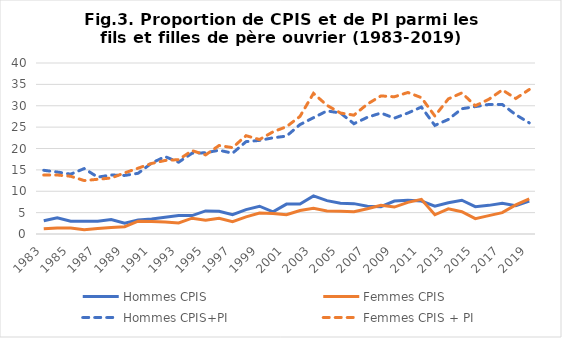
| Category | Hommes CPIS | Femmes CPIS | Hommes CPIS+PI | Femmes CPIS + PI |
|---|---|---|---|---|
| 1983.0 | 3.1 | 1.2 | 14.9 | 13.8 |
| 1984.0 | 3.8 | 1.4 | 14.5 | 13.8 |
| 1985.0 | 3 | 1.4 | 14 | 13.5 |
| 1986.0 | 3 | 1 | 15.3 | 12.5 |
| 1987.0 | 3 | 1.3 | 13.3 | 12.8 |
| 1988.0 | 3.4 | 1.5 | 13.8 | 13.1 |
| 1989.0 | 2.5 | 1.7 | 13.7 | 14.3 |
| 1990.0 | 3.3 | 3 | 14.2 | 15.4 |
| 1991.0 | 3.5 | 2.9 | 16.6 | 16.5 |
| 1992.0 | 3.9 | 2.8 | 18.1 | 17.2 |
| 1993.0 | 4.3 | 2.6 | 16.8 | 17.4 |
| 1994.0 | 4.3 | 3.7 | 18.9 | 19.5 |
| 1995.0 | 5.4 | 3.2 | 19 | 18.5 |
| 1996.0 | 5.3 | 3.7 | 19.6 | 20.7 |
| 1997.0 | 4.5 | 2.9 | 18.9 | 20.2 |
| 1998.0 | 5.7 | 4 | 21.6 | 23 |
| 1999.0 | 6.5 | 4.9 | 21.9 | 22.1 |
| 2000.0 | 5.2 | 4.8 | 22.5 | 23.9 |
| 2001.0 | 7 | 4.5 | 22.9 | 25.1 |
| 2002.0 | 7 | 5.5 | 25.6 | 27.5 |
| 2003.0 | 8.9 | 6 | 27.2 | 32.9 |
| 2004.0 | 7.8 | 5.4 | 28.8 | 30.1 |
| 2005.0 | 7.2 | 5.3 | 28.3 | 28.3 |
| 2006.0 | 7.1 | 5.2 | 25.8 | 27.8 |
| 2007.0 | 6.5 | 5.9 | 27.3 | 30.4 |
| 2008.0 | 6.4 | 6.7 | 28.3 | 32.3 |
| 2009.0 | 7.7 | 6.3 | 27.1 | 32.1 |
| 2010.0 | 7.9 | 7.4 | 28.3 | 33.1 |
| 2011.0 | 7.7 | 8.1 | 29.7 | 31.9 |
| 2012.0 | 6.5 | 4.5 | 25.4 | 27.6 |
| 2013.0 | 7.3 | 5.9 | 26.8 | 31.6 |
| 2014.0 | 7.9 | 5.2 | 29.3 | 33 |
| 2015.0 | 6.4 | 3.6 | 29.8 | 30 |
| 2016.0 | 6.7 | 4.3 | 30.3 | 31.5 |
| 2017.0 | 7.2 | 5 | 30.3 | 33.7 |
| 2018.0 | 6.6 | 6.8 | 27.9 | 31.7 |
| 2019.0 | 7.7 | 8.2 | 26 | 33.8 |